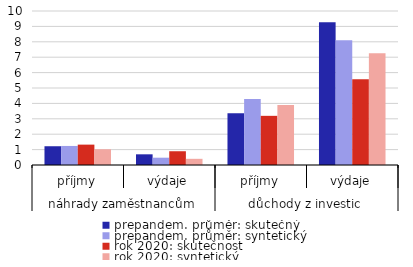
| Category | prepandem. průměr: skutečný | prepandem. průměr: syntetický | rok 2020: skutečnost | rok 2020: syntetický |
|---|---|---|---|---|
| 0 | 1.218 | 1.237 | 1.323 | 1.023 |
| 1 | 0.694 | 0.474 | 0.894 | 0.401 |
| 2 | 3.353 | 4.288 | 3.192 | 3.901 |
| 3 | 9.274 | 8.099 | 5.572 | 7.259 |